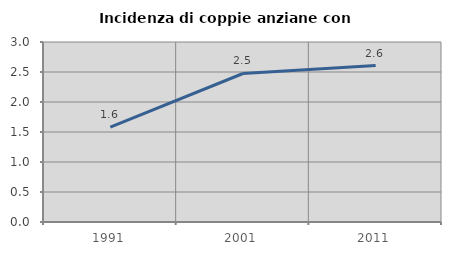
| Category | Incidenza di coppie anziane con figli |
|---|---|
| 1991.0 | 1.581 |
| 2001.0 | 2.475 |
| 2011.0 | 2.607 |